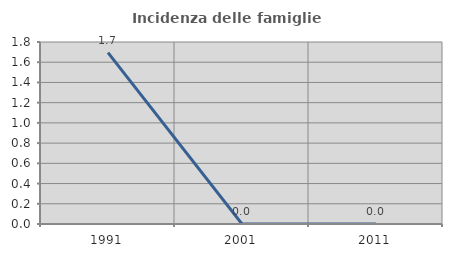
| Category | Incidenza delle famiglie numerose |
|---|---|
| 1991.0 | 1.695 |
| 2001.0 | 0 |
| 2011.0 | 0 |